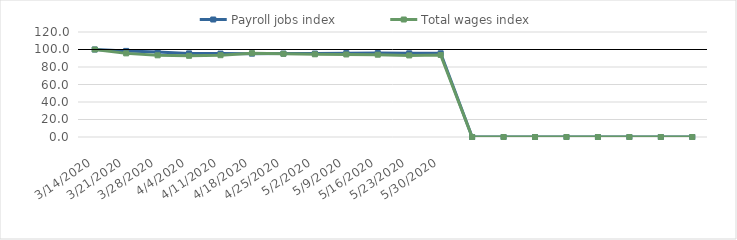
| Category | Payroll jobs index | Total wages index |
|---|---|---|
| 14/03/2020 | 100 | 100 |
| 21/03/2020 | 98.385 | 95.573 |
| 28/03/2020 | 97.009 | 93.34 |
| 04/04/2020 | 95.545 | 92.794 |
| 11/04/2020 | 95.321 | 93.491 |
| 18/04/2020 | 95.271 | 95.786 |
| 25/04/2020 | 95.321 | 95.078 |
| 02/05/2020 | 95.368 | 94.523 |
| 09/05/2020 | 95.857 | 94.324 |
| 16/05/2020 | 95.944 | 94.044 |
| 23/05/2020 | 95.614 | 93.229 |
| 30/05/2020 | 95.655 | 93.745 |